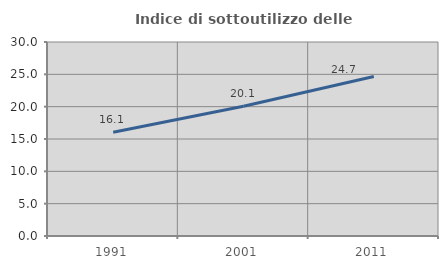
| Category | Indice di sottoutilizzo delle abitazioni  |
|---|---|
| 1991.0 | 16.051 |
| 2001.0 | 20.067 |
| 2011.0 | 24.672 |